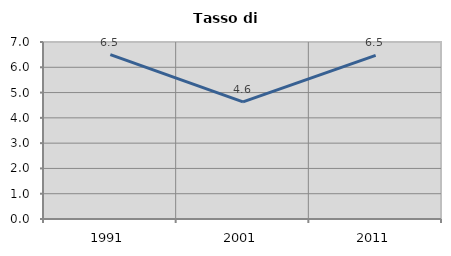
| Category | Tasso di disoccupazione   |
|---|---|
| 1991.0 | 6.5 |
| 2001.0 | 4.633 |
| 2011.0 | 6.474 |